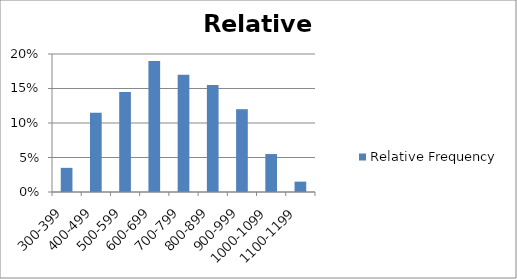
| Category | Relative Frequency |
|---|---|
| 300-399 | 0.035 |
| 400-499 | 0.115 |
| 500-599 | 0.145 |
| 600-699 | 0.19 |
| 700-799 | 0.17 |
| 800-899 | 0.155 |
| 900-999 | 0.12 |
| 1000-1099 | 0.055 |
| 1100-1199 | 0.015 |